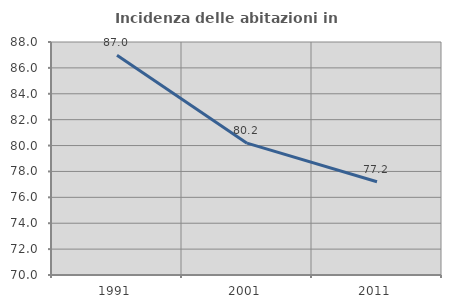
| Category | Incidenza delle abitazioni in proprietà  |
|---|---|
| 1991.0 | 86.974 |
| 2001.0 | 80.185 |
| 2011.0 | 77.206 |